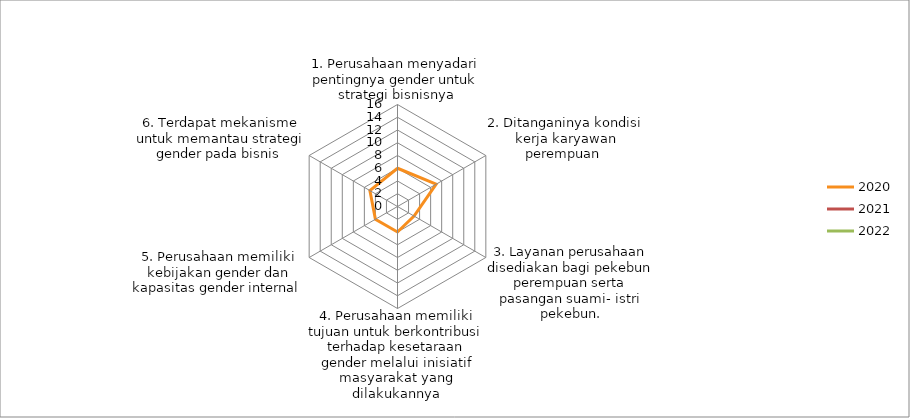
| Category | 2020 | 2021 | 2022 | 2023 |
|---|---|---|---|---|
| 1. Perusahaan menyadari pentingnya gender untuk strategi bisnisnya | 6 | 0 | 0 | 15 |
| 2. Ditanganinya kondisi kerja karyawan perempuan  | 7 | 0 | 0 | 0 |
| 3. Layanan perusahaan disediakan bagi pekebun perempuan serta pasangan suami- istri pekebun. | 3 | 0 | 0 | 0 |
| 4. Perusahaan memiliki tujuan untuk berkontribusi terhadap kesetaraan gender melalui inisiatif masyarakat yang dilakukannya | 4 | 0 | 0 | 0 |
| 5. Perusahaan memiliki kebijakan gender dan kapasitas gender internal  | 4 | 0 | 0 | 0 |
| 6. Terdapat mekanisme untuk memantau strategi gender pada bisnis  | 5 | 0 | 0 | 0 |